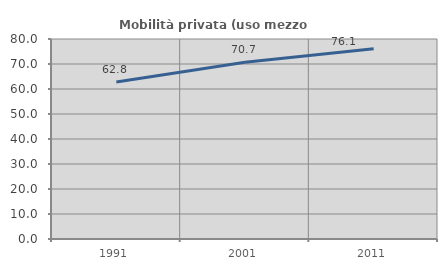
| Category | Mobilità privata (uso mezzo privato) |
|---|---|
| 1991.0 | 62.818 |
| 2001.0 | 70.673 |
| 2011.0 | 76.092 |